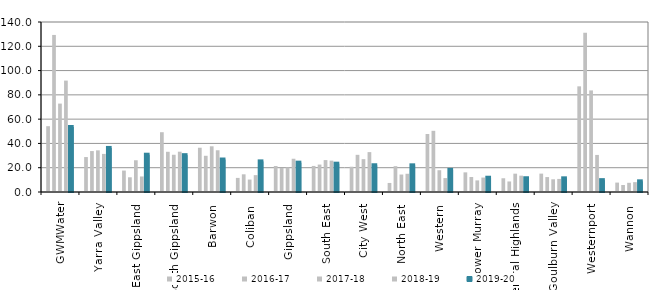
| Category | 2015-16 | 2016-17 | 2017-18 | 2018-19 | 2019-20 |
|---|---|---|---|---|---|
| GWMWater | 54.205 | 129.337 | 72.806 | 91.748 | 53.543 |
| Yarra Valley  | 28.785 | 33.716 | 34.312 | 31.364 | 36.289 |
| East Gippsland  | 17.657 | 12.114 | 26.143 | 12.796 | 30.707 |
| South Gippsland  | 49.237 | 33.113 | 30.664 | 33.18 | 30.338 |
| Barwon  | 36.454 | 29.829 | 37.634 | 34.372 | 26.755 |
| Coliban  | 11.602 | 14.569 | 10.24 | 13.887 | 25.21 |
| Gippsland  | 21.417 | 19.781 | 20.216 | 27.376 | 24.16 |
| South East  | 21.465 | 22.581 | 26.285 | 25.83 | 23.321 |
| City West  | 20.806 | 30.608 | 27.062 | 32.851 | 22.024 |
| North East  | 7.446 | 21.275 | 14.388 | 15.02 | 21.966 |
| Western  | 47.767 | 50.389 | 17.947 | 11.463 | 18.217 |
| Lower Murray  | 16.181 | 12.375 | 9.566 | 11.892 | 11.755 |
| Central Highlands  | 11.312 | 8.675 | 15.101 | 13.454 | 11.33 |
| Goulburn Valley  | 15.138 | 12.297 | 10.461 | 10.77 | 11.259 |
| Westernport  | 87.017 | 131.229 | 83.664 | 30.519 | 9.766 |
| Wannon  | 7.743 | 5.783 | 7.568 | 8.113 | 8.786 |